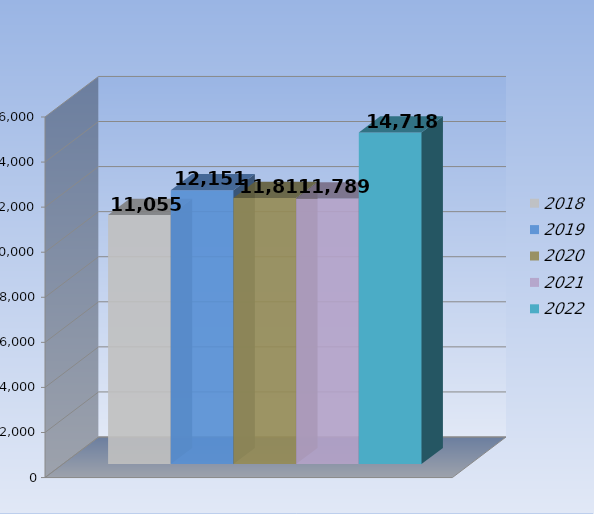
| Category | 2018 | 2019 | 2020 | 2021 | 2022 |
|---|---|---|---|---|---|
| 0 | 11055 | 12151 | 11811 | 11789 | 14718 |